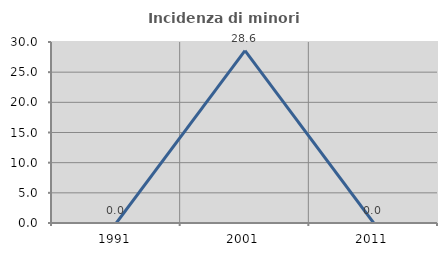
| Category | Incidenza di minori stranieri |
|---|---|
| 1991.0 | 0 |
| 2001.0 | 28.571 |
| 2011.0 | 0 |